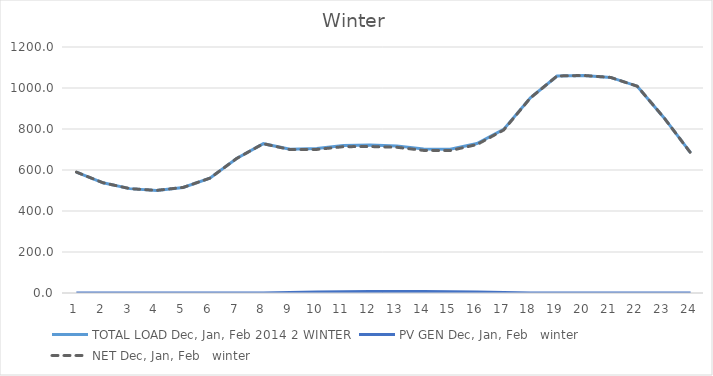
| Category | TOTAL LOAD | PV GEN | NET |
|---|---|---|---|
| 0 | 589.788 | 0 | 589.788 |
| 1 | 537.686 | 0 | 537.686 |
| 2 | 509.14 | 0 | 509.14 |
| 3 | 500.571 | 0 | 500.571 |
| 4 | 515.05 | 0 | 515.05 |
| 5 | 560.145 | 0 | 560.145 |
| 6 | 656.06 | 0 | 656.06 |
| 7 | 728.498 | 0.05 | 728.448 |
| 8 | 701.767 | 2.209 | 699.558 |
| 9 | 704.953 | 4.647 | 700.306 |
| 10 | 719.731 | 5.958 | 713.773 |
| 11 | 721.48 | 7.018 | 714.461 |
| 12 | 717.677 | 6.877 | 710.799 |
| 13 | 702.594 | 6.949 | 695.645 |
| 14 | 701.318 | 6.457 | 694.861 |
| 15 | 729.222 | 5.084 | 724.138 |
| 16 | 798.099 | 2.951 | 795.149 |
| 17 | 952.102 | 0.535 | 951.567 |
| 18 | 1058.649 | 0 | 1058.649 |
| 19 | 1061.093 | 0 | 1061.093 |
| 20 | 1051.614 | 0 | 1051.614 |
| 21 | 1008.844 | 0 | 1008.844 |
| 22 | 855.182 | 0 | 855.182 |
| 23 | 683.502 | 0 | 683.502 |